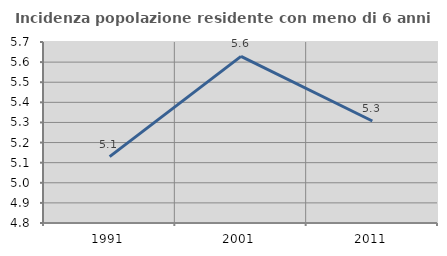
| Category | Incidenza popolazione residente con meno di 6 anni |
|---|---|
| 1991.0 | 5.13 |
| 2001.0 | 5.628 |
| 2011.0 | 5.307 |